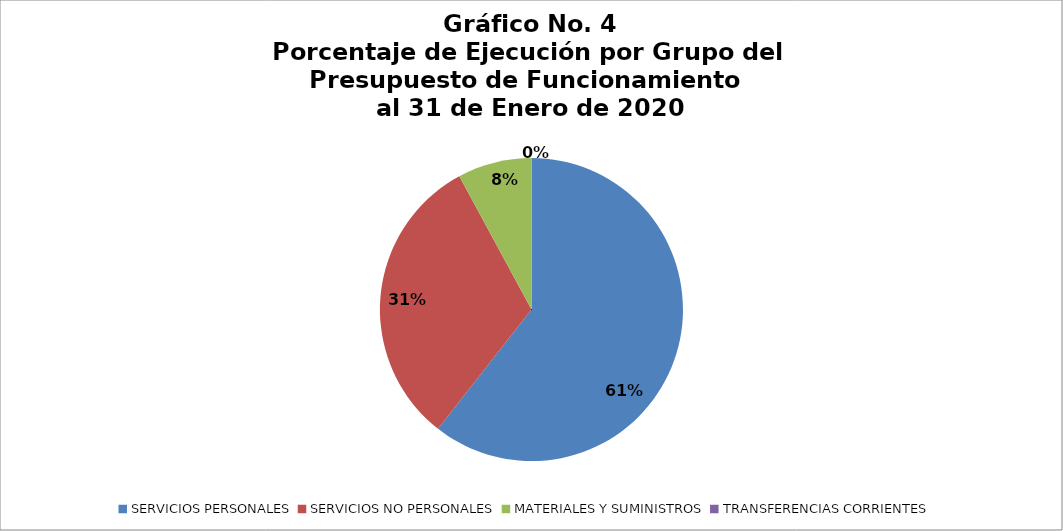
| Category | Series 0 |
|---|---|
| SERVICIOS PERSONALES | 65623 |
| SERVICIOS NO PERSONALES | 34130.49 |
| MATERIALES Y SUMINISTROS | 8561.73 |
| TRANSFERENCIAS CORRIENTES | 0 |